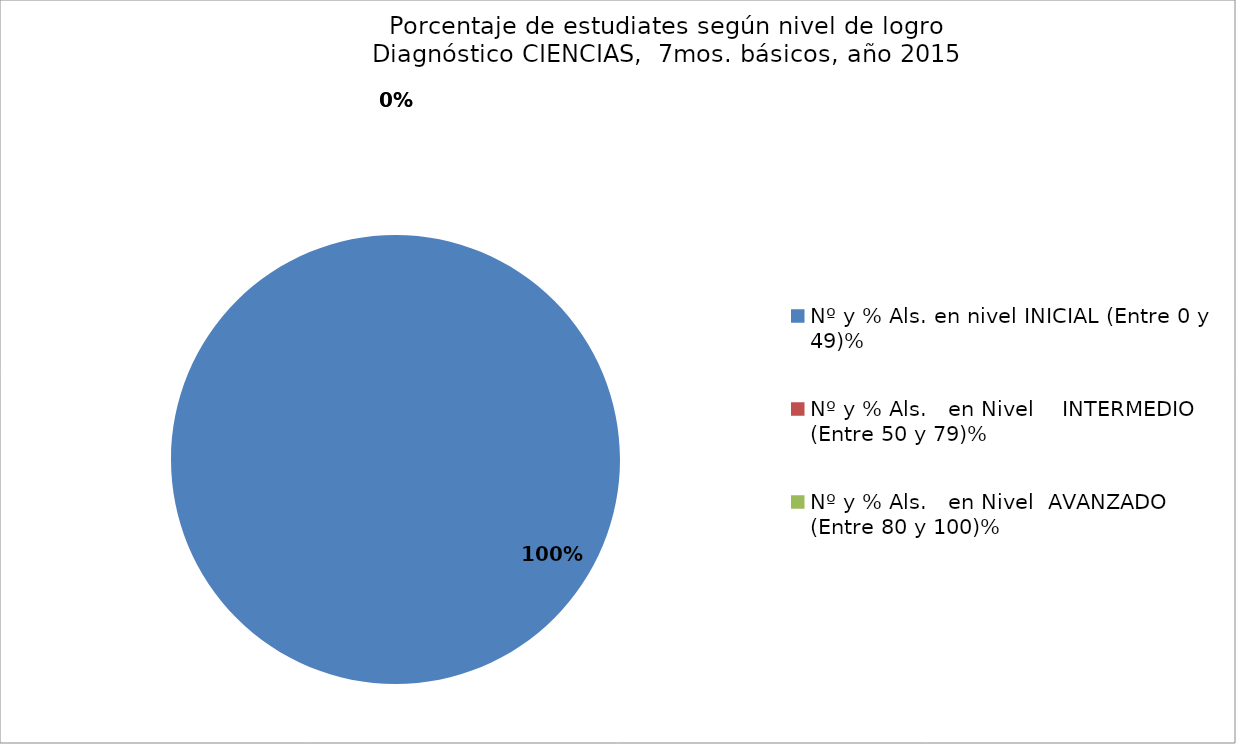
| Category | Series 0 |
|---|---|
| Nº y % Als. en nivel INICIAL (Entre 0 y 49)% | 1 |
| Nº y % Als.   en Nivel    INTERMEDIO (Entre 50 y 79)% | 0 |
| Nº y % Als.   en Nivel  AVANZADO    (Entre 80 y 100)% | 0 |